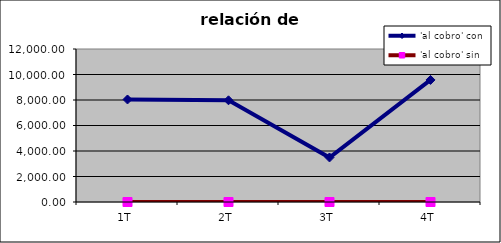
| Category | 'al cobro' con | 'al cobro' sin |
|---|---|---|
| 1T | 8040.28 | 0 |
| 2T | 7976.86 | 0 |
| 3T | 3491.48 | 0 |
| 4T | 9572.46 | 0 |